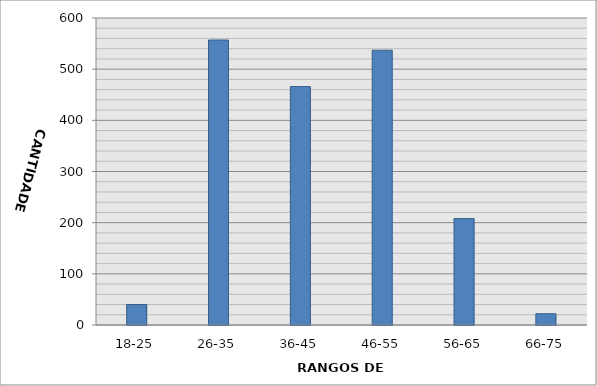
| Category | Series 0 |
|---|---|
| 18-25 | 40 |
| 26-35 | 557 |
| 36-45 | 466 |
| 46-55 | 537 |
| 56-65 | 208 |
| 66-75 | 22 |